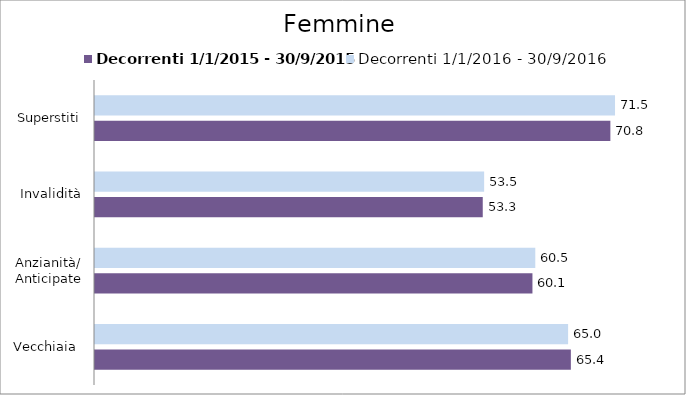
| Category | Decorrenti 1/1/2015 - 30/9/2015 | Decorrenti 1/1/2016 - 30/9/2016 |
|---|---|---|
| Vecchiaia  | 65.41 | 65.03 |
| Anzianità/ Anticipate | 60.13 | 60.52 |
| Invalidità | 53.3 | 53.49 |
| Superstiti | 70.84 | 71.48 |